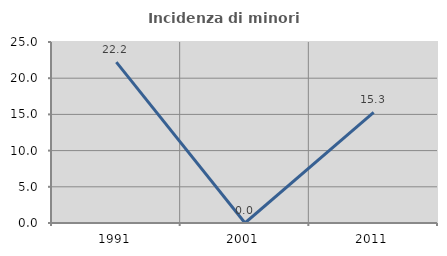
| Category | Incidenza di minori stranieri |
|---|---|
| 1991.0 | 22.222 |
| 2001.0 | 0 |
| 2011.0 | 15.278 |